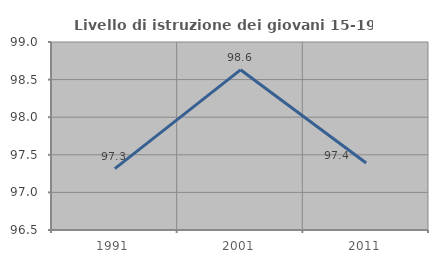
| Category | Livello di istruzione dei giovani 15-19 anni |
|---|---|
| 1991.0 | 97.315 |
| 2001.0 | 98.63 |
| 2011.0 | 97.391 |